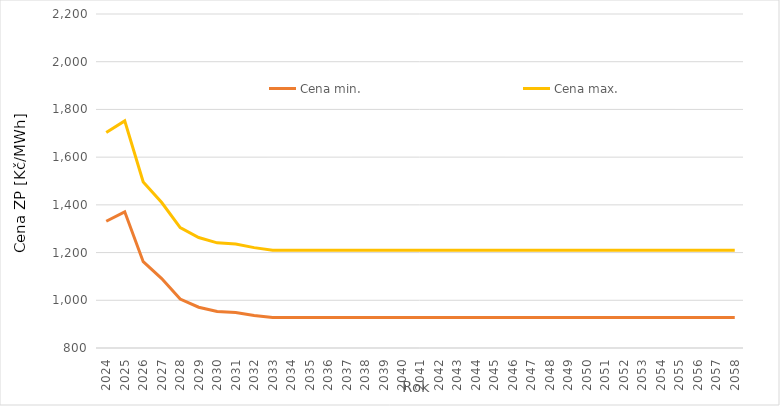
| Category | Cena min. | Cena max. |
|---|---|---|
| 2024.0 | 1331.196 | 1703.229 |
| 2025.0 | 1370.932 | 1751.794 |
| 2026.0 | 1161.832 | 1496.228 |
| 2027.0 | 1090.99 | 1409.644 |
| 2028.0 | 1005.098 | 1304.665 |
| 2029.0 | 970.947 | 1262.924 |
| 2030.0 | 952.828 | 1240.779 |
| 2031.0 | 948.547 | 1235.546 |
| 2032.0 | 936.409 | 1220.711 |
| 2033.0 | 927.581 | 1209.922 |
| 2034.0 | 927.581 | 1209.922 |
| 2035.0 | 927.581 | 1209.922 |
| 2036.0 | 927.581 | 1209.922 |
| 2037.0 | 927.581 | 1209.922 |
| 2038.0 | 927.581 | 1209.922 |
| 2039.0 | 927.581 | 1209.922 |
| 2040.0 | 927.581 | 1209.922 |
| 2041.0 | 927.581 | 1209.922 |
| 2042.0 | 927.581 | 1209.922 |
| 2043.0 | 927.581 | 1209.922 |
| 2044.0 | 927.581 | 1209.922 |
| 2045.0 | 927.581 | 1209.922 |
| 2046.0 | 927.581 | 1209.922 |
| 2047.0 | 927.581 | 1209.922 |
| 2048.0 | 927.581 | 1209.922 |
| 2049.0 | 927.581 | 1209.922 |
| 2050.0 | 927.581 | 1209.922 |
| 2051.0 | 927.581 | 1209.922 |
| 2052.0 | 927.581 | 1209.922 |
| 2053.0 | 927.581 | 1209.922 |
| 2054.0 | 927.581 | 1209.922 |
| 2055.0 | 927.581 | 1209.922 |
| 2056.0 | 927.581 | 1209.922 |
| 2057.0 | 927.581 | 1209.922 |
| 2058.0 | 927.581 | 1209.922 |